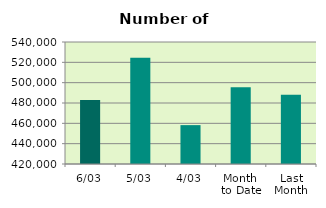
| Category | Series 0 |
|---|---|
| 6/03 | 482984 |
| 5/03 | 524538 |
| 4/03 | 458240 |
| Month 
to Date | 495498 |
| Last
Month | 488116.6 |